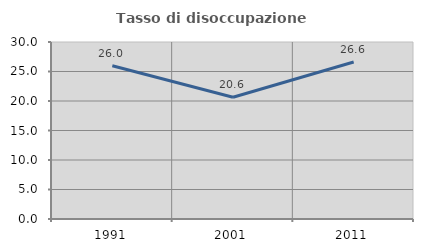
| Category | Tasso di disoccupazione giovanile  |
|---|---|
| 1991.0 | 25.979 |
| 2001.0 | 20.635 |
| 2011.0 | 26.606 |